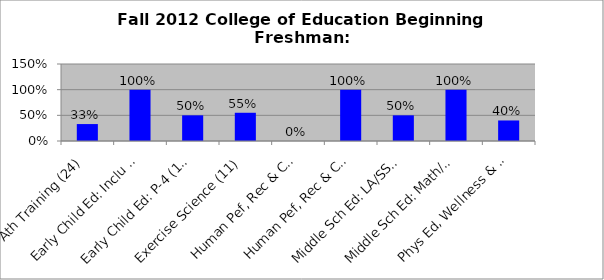
| Category | Series 0 |
|---|---|
| Ath Training (24) | 0.33 |
| Early Child Ed: Inclu (1) | 1 |
| Early Child Ed: P-4 (18) | 0.5 |
| Exercise Science (11) | 0.55 |
| Human Pef, Rec & Comm Sports (2) | 0 |
| Human Pef, Rec & Comm (1) | 1 |
| Middle Sch Ed: LA/SS (2) | 0.5 |
| Middle Sch Ed: Math/Sci: (1) | 1 |
| Phys Ed, Wellness & Leisure (20) | 0.4 |